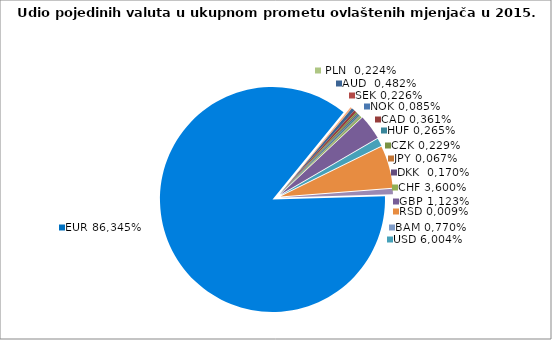
| Category | AUD |
|---|---|
| 0 | 0.005 |
| 1 | 0.004 |
| 2 | 0.002 |
| 3 | 0.002 |
| 4 | 0.003 |
| 5 | 0.001 |
| 6 | 0.001 |
| 7 | 0 |
| 8 | 0.002 |
| 9 | 0.036 |
| 10 | 0.011 |
| 11 | 0.06 |
| 12 | 0 |
| 13 | 0 |
| 14 | 0 |
| 15 | 0.008 |
| 16 | 0.863 |
| 17 | 0.002 |